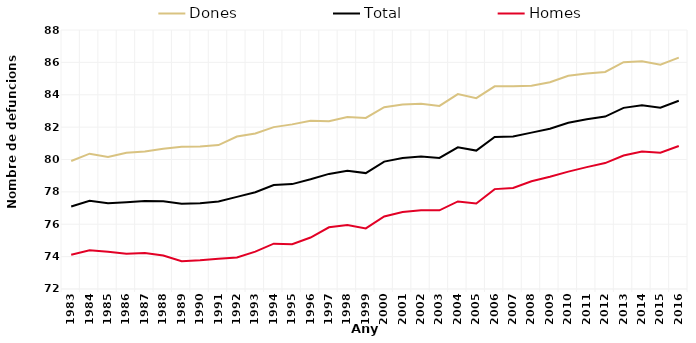
| Category | Dones | Total | Homes |
|---|---|---|---|
| 1983.0 | 79.91 | 77.1 | 74.12 |
| 1984.0 | 80.36 | 77.45 | 74.39 |
| 1985.0 | 80.15 | 77.3 | 74.3 |
| 1986.0 | 80.42 | 77.36 | 74.18 |
| 1987.0 | 80.5 | 77.43 | 74.23 |
| 1988.0 | 80.67 | 77.42 | 74.07 |
| 1989.0 | 80.78 | 77.27 | 73.71 |
| 1990.0 | 80.8 | 77.29 | 73.77 |
| 1991.0 | 80.89 | 77.41 | 73.87 |
| 1992.0 | 81.42 | 77.69 | 73.95 |
| 1993.0 | 81.61 | 77.98 | 74.31 |
| 1994.0 | 82 | 78.42 | 74.8 |
| 1995.0 | 82.17 | 78.48 | 74.77 |
| 1996.0 | 82.4 | 78.78 | 75.18 |
| 1997.0 | 82.36 | 79.11 | 75.81 |
| 1998.0 | 82.62 | 79.3 | 75.96 |
| 1999.0 | 82.57 | 79.16 | 75.74 |
| 2000.0 | 83.23 | 79.87 | 76.48 |
| 2001.0 | 83.4 | 80.09 | 76.75 |
| 2002.0 | 83.44 | 80.18 | 76.87 |
| 2003.0 | 83.31 | 80.1 | 76.86 |
| 2004.0 | 84.04 | 80.75 | 77.41 |
| 2005.0 | 83.79 | 80.55 | 77.28 |
| 2006.0 | 84.52 | 81.39 | 78.17 |
| 2007.0 | 84.52 | 81.42 | 78.24 |
| 2008.0 | 84.56 | 81.66 | 78.66 |
| 2009.0 | 84.77 | 81.9 | 78.93 |
| 2010.0 | 85.17 | 82.27 | 79.25 |
| 2011.0 | 85.31 | 82.48 | 79.53 |
| 2012.0 | 85.41 | 82.65 | 79.78 |
| 2013.0 | 86.01 | 83.19 | 80.25 |
| 2014.0 | 86.07 | 83.35 | 80.5 |
| 2015.0 | 85.86 | 83.2 | 80.42 |
| 2016.0 | 86.29 | 83.63 | 80.83 |